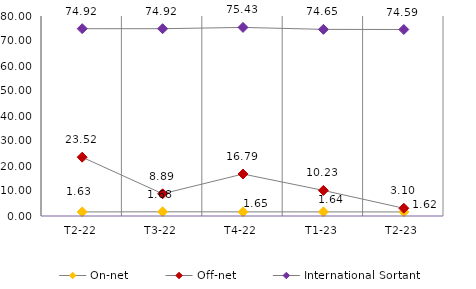
| Category | On-net | Off-net | International Sortant |
|---|---|---|---|
| T2-22 | 1.626 | 23.523 | 74.921 |
| T3-22 | 1.675 | 8.89 | 74.916 |
| T4-22 | 1.652 | 16.792 | 75.432 |
| T1-23 | 1.642 | 10.235 | 74.654 |
| T2-23 | 1.622 | 3.098 | 74.594 |